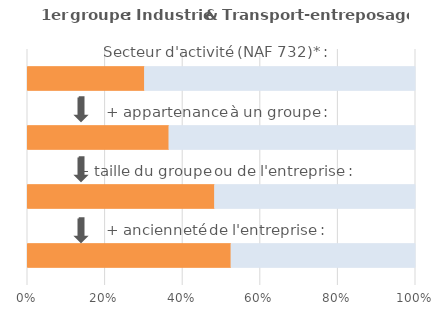
| Category | % de variance expliquée par les caractéristiques | % de variance intra-classe |
|---|---|---|
| 0 | 0.525 | 0.475 |
| 1 | 0.483 | 0.517 |
| 2 | 0.365 | 0.635 |
| 3 | 0.302 | 0.698 |